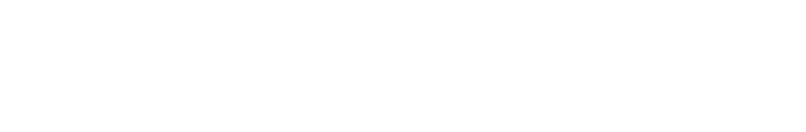
| Category | TOTAL FUNDING | TOTAL EXPENSES |
|---|---|---|
| 0 | 0 | 0 |